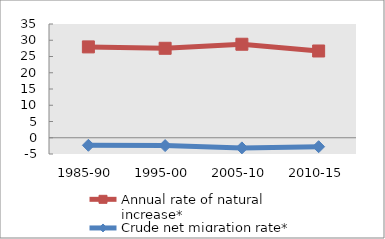
| Category | Annual rate of natural increase* | Crude net migration rate* |
|---|---|---|
| 1985-90 | 27.955 | -2.32 |
| 1995-00 | 27.526 | -2.414 |
| 2005-10 | 28.773 | -3.116 |
| 2010-15 | 26.694 | -2.753 |